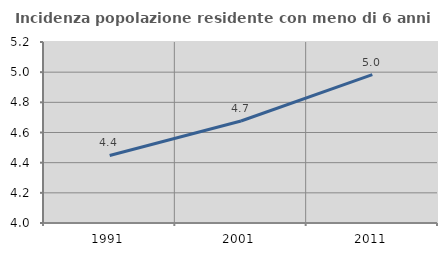
| Category | Incidenza popolazione residente con meno di 6 anni |
|---|---|
| 1991.0 | 4.448 |
| 2001.0 | 4.676 |
| 2011.0 | 4.984 |